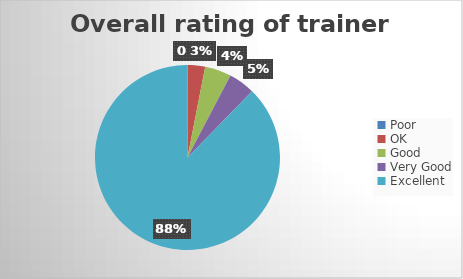
| Category | Overall rating of trainer (%) |
|---|---|
| Poor | 0 |
| OK | 3.07 |
| Good | 4.61 |
| Very Good | 4.61 |
| Excellent | 87.69 |